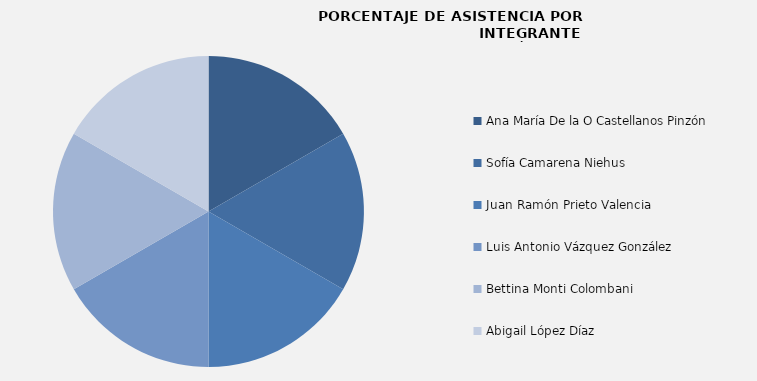
| Category | Series 0 |
|---|---|
| Ana María De la O Castellanos Pinzón | 100 |
| Sofía Camarena Niehus | 100 |
| Juan Ramón Prieto Valencia  | 100 |
| Luis Antonio Vázquez González | 100 |
| Bettina Monti Colombani | 100 |
| Abigail López Díaz | 100 |